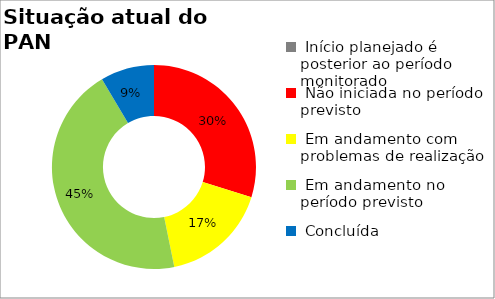
| Category | Series 0 |
|---|---|
|  Início planejado é posterior ao período monitorado | 0 |
|  Não iniciada no período previsto | 0.298 |
|  Em andamento com problemas de realização | 0.17 |
|  Em andamento no período previsto  | 0.447 |
|  Concluída | 0.085 |